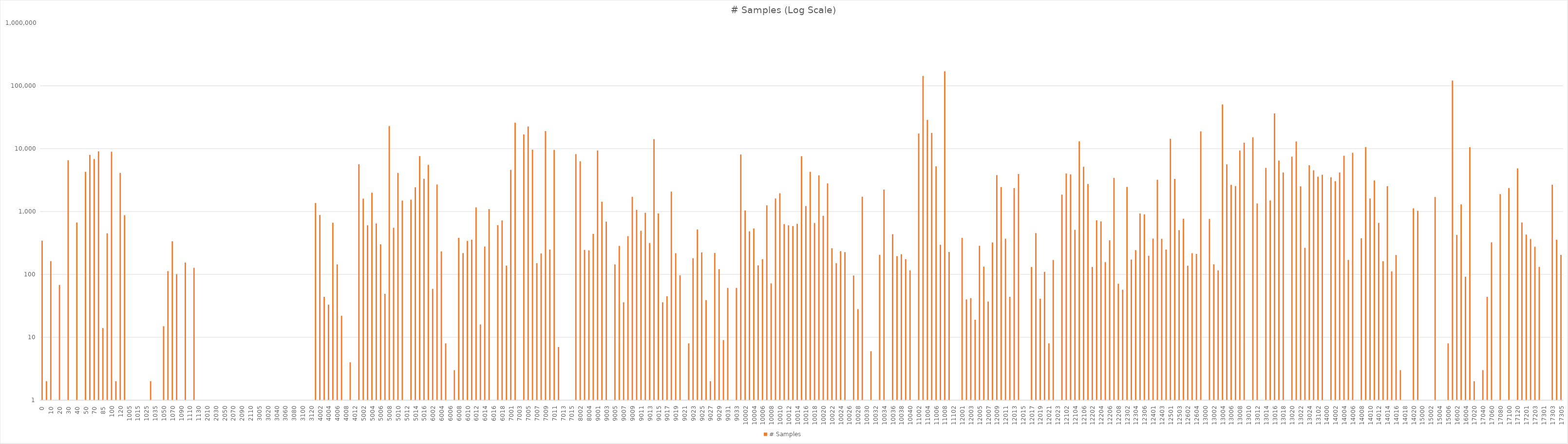
| Category | # Samples |
|---|---|
| 0.0 | 344 |
| 5.0 | 2 |
| 10.0 | 163 |
| 15.0 | 0 |
| 20.0 | 68 |
| 25.0 | 0 |
| 30.0 | 6531 |
| 35.0 | 0 |
| 40.0 | 669 |
| 45.0 | 0 |
| 50.0 | 4276 |
| 60.0 | 7970 |
| 70.0 | 6830 |
| 80.0 | 9056 |
| 85.0 | 14 |
| 90.0 | 449 |
| 100.0 | 8936 |
| 110.0 | 2 |
| 120.0 | 4113 |
| 130.0 | 874 |
| 1005.0 | 0 |
| 1010.0 | 0 |
| 1015.0 | 0 |
| 1020.0 | 0 |
| 1025.0 | 0 |
| 1030.0 | 2 |
| 1035.0 | 0 |
| 1040.0 | 0 |
| 1050.0 | 15 |
| 1060.0 | 113 |
| 1070.0 | 336 |
| 1080.0 | 101 |
| 1090.0 | 0 |
| 1100.0 | 154 |
| 1110.0 | 0 |
| 1120.0 | 127 |
| 1130.0 | 1 |
| 2005.0 | 0 |
| 2010.0 | 0 |
| 2020.0 | 0 |
| 2030.0 | 0 |
| 2040.0 | 0 |
| 2050.0 | 0 |
| 2060.0 | 0 |
| 2070.0 | 0 |
| 2080.0 | 0 |
| 2090.0 | 0 |
| 2100.0 | 0 |
| 2110.0 | 0 |
| 2120.0 | 0 |
| 3005.0 | 0 |
| 3010.0 | 0 |
| 3020.0 | 0 |
| 3030.0 | 0 |
| 3040.0 | 0 |
| 3050.0 | 1 |
| 3060.0 | 0 |
| 3070.0 | 0 |
| 3080.0 | 0 |
| 3090.0 | 0 |
| 3100.0 | 0 |
| 3110.0 | 0 |
| 3120.0 | 0 |
| 4001.0 | 1369 |
| 4002.0 | 882 |
| 4003.0 | 44 |
| 4004.0 | 33 |
| 4005.0 | 663 |
| 4006.0 | 144 |
| 4007.0 | 22 |
| 4008.0 | 0 |
| 4010.0 | 4 |
| 4012.0 | 1 |
| 5001.0 | 5659 |
| 5002.0 | 1603 |
| 5003.0 | 605 |
| 5004.0 | 1994 |
| 5005.0 | 645 |
| 5006.0 | 301 |
| 5007.0 | 49 |
| 5008.0 | 22937 |
| 5009.0 | 552 |
| 5010.0 | 4117 |
| 5011.0 | 1497 |
| 5012.0 | 0 |
| 5013.0 | 1543 |
| 5014.0 | 2428 |
| 5015.0 | 7630 |
| 5016.0 | 3327 |
| 6001.0 | 5522 |
| 6002.0 | 59 |
| 6003.0 | 2692 |
| 6004.0 | 232 |
| 6005.0 | 8 |
| 6006.0 | 0 |
| 6007.0 | 3 |
| 6008.0 | 382 |
| 6009.0 | 218 |
| 6010.0 | 341 |
| 6011.0 | 357 |
| 6012.0 | 1164 |
| 6013.0 | 16 |
| 6014.0 | 277 |
| 6015.0 | 1092 |
| 6016.0 | 0 |
| 6017.0 | 608 |
| 6018.0 | 723 |
| 6019.0 | 138 |
| 7001.0 | 4606 |
| 7002.0 | 25892 |
| 7003.0 | 0 |
| 7004.0 | 16854 |
| 7005.0 | 22542 |
| 7006.0 | 9664 |
| 7007.0 | 151 |
| 7008.0 | 215 |
| 7009.0 | 19046 |
| 7010.0 | 249 |
| 7011.0 | 9553 |
| 7012.0 | 7 |
| 7013.0 | 0 |
| 7014.0 | 0 |
| 7015.0 | 0 |
| 8001.0 | 8189 |
| 8002.0 | 6281 |
| 8003.0 | 245 |
| 8004.0 | 241 |
| 8005.0 | 441 |
| 9001.0 | 9344 |
| 9002.0 | 1430 |
| 9003.0 | 690 |
| 9004.0 | 0 |
| 9005.0 | 144 |
| 9006.0 | 284 |
| 9007.0 | 36 |
| 9008.0 | 406 |
| 9009.0 | 1719 |
| 9010.0 | 1066 |
| 9011.0 | 494 |
| 9012.0 | 956 |
| 9013.0 | 316 |
| 9014.0 | 14165 |
| 9015.0 | 931 |
| 9016.0 | 36 |
| 9017.0 | 45 |
| 9018.0 | 2068 |
| 9019.0 | 217 |
| 9020.0 | 97 |
| 9021.0 | 0 |
| 9022.0 | 8 |
| 9023.0 | 181 |
| 9024.0 | 519 |
| 9025.0 | 223 |
| 9026.0 | 39 |
| 9027.0 | 2 |
| 9028.0 | 219 |
| 9029.0 | 121 |
| 9030.0 | 9 |
| 9031.0 | 61 |
| 9032.0 | 0 |
| 9033.0 | 61 |
| 10001.0 | 8079 |
| 10002.0 | 1041 |
| 10003.0 | 484 |
| 10004.0 | 537 |
| 10005.0 | 139 |
| 10006.0 | 175 |
| 10007.0 | 1253 |
| 10008.0 | 72 |
| 10009.0 | 1614 |
| 10010.0 | 1953 |
| 10011.0 | 632 |
| 10012.0 | 604 |
| 10013.0 | 587 |
| 10014.0 | 637 |
| 10015.0 | 7596 |
| 10016.0 | 1225 |
| 10017.0 | 4285 |
| 10018.0 | 657 |
| 10019.0 | 3770 |
| 10020.0 | 854 |
| 10021.0 | 2807 |
| 10022.0 | 261 |
| 10023.0 | 151 |
| 10024.0 | 235 |
| 10025.0 | 226 |
| 10026.0 | 0 |
| 10027.0 | 96 |
| 10028.0 | 28 |
| 10029.0 | 1727 |
| 10030.0 | 0 |
| 10031.0 | 6 |
| 10032.0 | 0 |
| 10033.0 | 205 |
| 10034.0 | 2233 |
| 10035.0 | 0 |
| 10036.0 | 436 |
| 10037.0 | 195 |
| 10038.0 | 209 |
| 10039.0 | 175 |
| 10040.0 | 116 |
| 11001.0 | 0 |
| 11002.0 | 17382 |
| 11003.0 | 143793 |
| 11004.0 | 28678 |
| 11005.0 | 17822 |
| 11006.0 | 5231 |
| 11007.0 | 296 |
| 11008.0 | 169737 |
| 11101.0 | 227 |
| 11102.0 | 0 |
| 12000.0 | 1 |
| 12001.0 | 381 |
| 12002.0 | 40 |
| 12003.0 | 42 |
| 12004.0 | 19 |
| 12005.0 | 285 |
| 12006.0 | 133 |
| 12007.0 | 37 |
| 12008.0 | 322 |
| 12009.0 | 3794 |
| 12010.0 | 2457 |
| 12011.0 | 369 |
| 12012.0 | 44 |
| 12013.0 | 2356 |
| 12014.0 | 3944 |
| 12015.0 | 0 |
| 12016.0 | 0 |
| 12017.0 | 131 |
| 12018.0 | 454 |
| 12019.0 | 41 |
| 12020.0 | 110 |
| 12021.0 | 8 |
| 12022.0 | 169 |
| 12023.0 | 0 |
| 12101.0 | 1856 |
| 12102.0 | 4022 |
| 12103.0 | 3907 |
| 12104.0 | 512 |
| 12105.0 | 13072 |
| 12106.0 | 5149 |
| 12201.0 | 2741 |
| 12202.0 | 131 |
| 12203.0 | 726 |
| 12204.0 | 697 |
| 12205.0 | 157 |
| 12206.0 | 349 |
| 12207.0 | 3427 |
| 12208.0 | 71 |
| 12301.0 | 57 |
| 12302.0 | 2467 |
| 12303.0 | 172 |
| 12304.0 | 243 |
| 12305.0 | 933 |
| 12306.0 | 903 |
| 12307.0 | 198 |
| 12401.0 | 372 |
| 12402.0 | 3210 |
| 12403.0 | 368 |
| 12404.0 | 249 |
| 12501.0 | 14337 |
| 12502.0 | 3302 |
| 12503.0 | 505 |
| 12601.0 | 767 |
| 12602.0 | 137 |
| 12603.0 | 217 |
| 12604.0 | 212 |
| 12605.0 | 18871 |
| 13000.0 | 0 |
| 13001.0 | 763 |
| 13002.0 | 145 |
| 13003.0 | 116 |
| 13004.0 | 50588 |
| 13005.0 | 5613 |
| 13006.0 | 2660 |
| 13007.0 | 2541 |
| 13008.0 | 9336 |
| 13009.0 | 12440 |
| 13010.0 | 0 |
| 13011.0 | 15144 |
| 13012.0 | 1341 |
| 13013.0 | 0 |
| 13014.0 | 4931 |
| 13015.0 | 1504 |
| 13016.0 | 36322 |
| 13017.0 | 6464 |
| 13018.0 | 4162 |
| 13019.0 | 1 |
| 13020.0 | 7458 |
| 13021.0 | 13030 |
| 13022.0 | 2522 |
| 13023.0 | 265 |
| 13024.0 | 5458 |
| 13101.0 | 4512 |
| 13102.0 | 3579 |
| 13103.0 | 3841 |
| 14000.0 | 0 |
| 14001.0 | 3499 |
| 14002.0 | 3044 |
| 14003.0 | 4161 |
| 14004.0 | 7711 |
| 14005.0 | 170 |
| 14006.0 | 8594 |
| 14007.0 | 0 |
| 14008.0 | 375 |
| 14009.0 | 10600 |
| 14010.0 | 1611 |
| 14011.0 | 3124 |
| 14012.0 | 661 |
| 14013.0 | 162 |
| 14014.0 | 2527 |
| 14015.0 | 112 |
| 14016.0 | 203 |
| 14017.0 | 3 |
| 14018.0 | 1 |
| 14019.0 | 0 |
| 14020.0 | 1121 |
| 14021.0 | 1027 |
| 15000.0 | 0 |
| 15001.0 | 0 |
| 15002.0 | 0 |
| 15003.0 | 1697 |
| 15004.0 | 0 |
| 15005.0 | 0 |
| 15006.0 | 8 |
| 16001.0 | 121001 |
| 16002.0 | 425 |
| 16003.0 | 1300 |
| 16004.0 | 92 |
| 16005.0 | 10540 |
| 17020.0 | 2 |
| 17030.0 | 0 |
| 17040.0 | 3 |
| 17050.0 | 44 |
| 17060.0 | 324 |
| 17070.0 | 0 |
| 17080.0 | 1892 |
| 17090.0 | 0 |
| 17100.0 | 2367 |
| 17110.0 | 0 |
| 17120.0 | 4851 |
| 17130.0 | 670 |
| 17201.0 | 431 |
| 17202.0 | 365 |
| 17203.0 | 275 |
| 17204.0 | 132 |
| 17301.0 | 0 |
| 17302.0 | 0 |
| 17303.0 | 2665 |
| 17304.0 | 356 |
| 17305.0 | 204 |